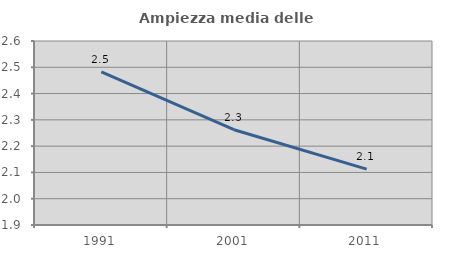
| Category | Ampiezza media delle famiglie |
|---|---|
| 1991.0 | 2.483 |
| 2001.0 | 2.262 |
| 2011.0 | 2.113 |